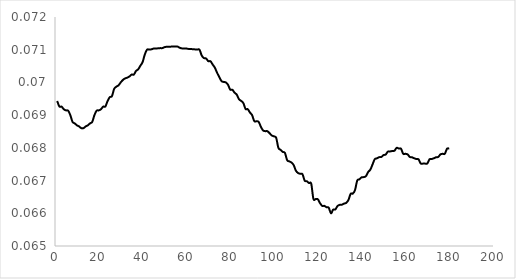
| Category | Series 0 |
|---|---|
| 1.0 | 0.069 |
| 2.0 | 0.069 |
| 3.0 | 0.069 |
| 4.0 | 0.069 |
| 5.0 | 0.069 |
| 6.0 | 0.069 |
| 7.0 | 0.069 |
| 8.0 | 0.069 |
| 9.0 | 0.069 |
| 10.0 | 0.069 |
| 11.0 | 0.069 |
| 12.0 | 0.069 |
| 13.0 | 0.069 |
| 14.0 | 0.069 |
| 15.0 | 0.069 |
| 16.0 | 0.069 |
| 17.0 | 0.069 |
| 18.0 | 0.069 |
| 19.0 | 0.069 |
| 20.0 | 0.069 |
| 21.0 | 0.069 |
| 22.0 | 0.069 |
| 23.0 | 0.069 |
| 24.0 | 0.069 |
| 25.0 | 0.07 |
| 26.0 | 0.07 |
| 27.0 | 0.07 |
| 28.0 | 0.07 |
| 29.0 | 0.07 |
| 30.0 | 0.07 |
| 31.0 | 0.07 |
| 32.0 | 0.07 |
| 33.0 | 0.07 |
| 34.0 | 0.07 |
| 35.0 | 0.07 |
| 36.0 | 0.07 |
| 37.0 | 0.07 |
| 38.0 | 0.07 |
| 39.0 | 0.071 |
| 40.0 | 0.071 |
| 41.0 | 0.071 |
| 42.0 | 0.071 |
| 43.0 | 0.071 |
| 44.0 | 0.071 |
| 45.0 | 0.071 |
| 46.0 | 0.071 |
| 47.0 | 0.071 |
| 48.0 | 0.071 |
| 49.0 | 0.071 |
| 50.0 | 0.071 |
| 51.0 | 0.071 |
| 52.0 | 0.071 |
| 53.0 | 0.071 |
| 54.0 | 0.071 |
| 55.0 | 0.071 |
| 56.0 | 0.071 |
| 57.0 | 0.071 |
| 58.0 | 0.071 |
| 59.0 | 0.071 |
| 60.0 | 0.071 |
| 61.0 | 0.071 |
| 62.0 | 0.071 |
| 63.0 | 0.071 |
| 64.0 | 0.071 |
| 65.0 | 0.071 |
| 66.0 | 0.071 |
| 67.0 | 0.071 |
| 68.0 | 0.071 |
| 69.0 | 0.071 |
| 70.0 | 0.071 |
| 71.0 | 0.071 |
| 72.0 | 0.071 |
| 73.0 | 0.07 |
| 74.0 | 0.07 |
| 75.0 | 0.07 |
| 76.0 | 0.07 |
| 77.0 | 0.07 |
| 78.0 | 0.07 |
| 79.0 | 0.07 |
| 80.0 | 0.07 |
| 81.0 | 0.07 |
| 82.0 | 0.07 |
| 83.0 | 0.07 |
| 84.0 | 0.069 |
| 85.0 | 0.069 |
| 86.0 | 0.069 |
| 87.0 | 0.069 |
| 88.0 | 0.069 |
| 89.0 | 0.069 |
| 90.0 | 0.069 |
| 91.0 | 0.069 |
| 92.0 | 0.069 |
| 93.0 | 0.069 |
| 94.0 | 0.069 |
| 95.0 | 0.069 |
| 96.0 | 0.069 |
| 97.0 | 0.069 |
| 98.0 | 0.068 |
| 99.0 | 0.068 |
| 100.0 | 0.068 |
| 101.0 | 0.068 |
| 102.0 | 0.068 |
| 103.0 | 0.068 |
| 104.0 | 0.068 |
| 105.0 | 0.068 |
| 106.0 | 0.068 |
| 107.0 | 0.068 |
| 108.0 | 0.068 |
| 109.0 | 0.067 |
| 110.0 | 0.067 |
| 111.0 | 0.067 |
| 112.0 | 0.067 |
| 113.0 | 0.067 |
| 114.0 | 0.067 |
| 115.0 | 0.067 |
| 116.0 | 0.067 |
| 117.0 | 0.067 |
| 118.0 | 0.066 |
| 119.0 | 0.066 |
| 120.0 | 0.066 |
| 121.0 | 0.066 |
| 122.0 | 0.066 |
| 123.0 | 0.066 |
| 124.0 | 0.066 |
| 125.0 | 0.066 |
| 126.0 | 0.066 |
| 127.0 | 0.066 |
| 128.0 | 0.066 |
| 129.0 | 0.066 |
| 130.0 | 0.066 |
| 131.0 | 0.066 |
| 132.0 | 0.066 |
| 133.0 | 0.066 |
| 134.0 | 0.066 |
| 135.0 | 0.067 |
| 136.0 | 0.067 |
| 137.0 | 0.067 |
| 138.0 | 0.067 |
| 139.0 | 0.067 |
| 140.0 | 0.067 |
| 141.0 | 0.067 |
| 142.0 | 0.067 |
| 143.0 | 0.067 |
| 144.0 | 0.067 |
| 145.0 | 0.067 |
| 146.0 | 0.068 |
| 147.0 | 0.068 |
| 148.0 | 0.068 |
| 149.0 | 0.068 |
| 150.0 | 0.068 |
| 151.0 | 0.068 |
| 152.0 | 0.068 |
| 153.0 | 0.068 |
| 154.0 | 0.068 |
| 155.0 | 0.068 |
| 156.0 | 0.068 |
| 157.0 | 0.068 |
| 158.0 | 0.068 |
| 159.0 | 0.068 |
| 160.0 | 0.068 |
| 161.0 | 0.068 |
| 162.0 | 0.068 |
| 163.0 | 0.068 |
| 164.0 | 0.068 |
| 165.0 | 0.068 |
| 166.0 | 0.068 |
| 167.0 | 0.068 |
| 168.0 | 0.068 |
| 169.0 | 0.068 |
| 170.0 | 0.068 |
| 171.0 | 0.068 |
| 172.0 | 0.068 |
| 173.0 | 0.068 |
| 174.0 | 0.068 |
| 175.0 | 0.068 |
| 176.0 | 0.068 |
| 177.0 | 0.068 |
| 178.0 | 0.068 |
| 179.0 | 0.068 |
| 180.0 | 0.068 |